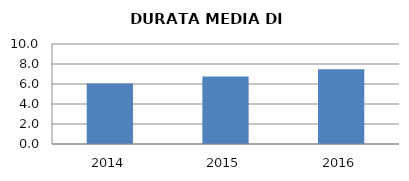
| Category | 2014 2015 2016 |
|---|---|
| 2014.0 | 6.062 |
| 2015.0 | 6.744 |
| 2016.0 | 7.465 |